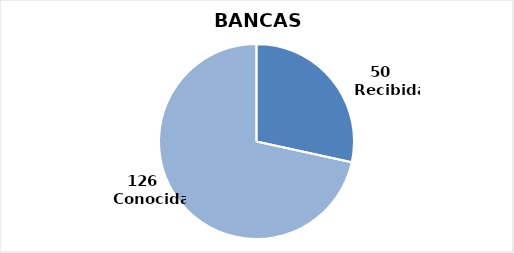
| Category | Series 0 |
|---|---|
| 0 | 50 |
| 1 | 126 |